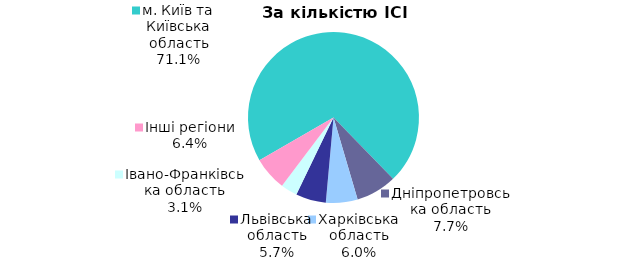
| Category | Series 0 |
|---|---|
| м. Київ та Київська область | 0.711 |
| Дніпропетровська область | 0.077 |
| Харківська область | 0.06 |
| Львівська область | 0.057 |
| Iвано-Франкiвська область | 0.031 |
| Інші регіони | 0.064 |